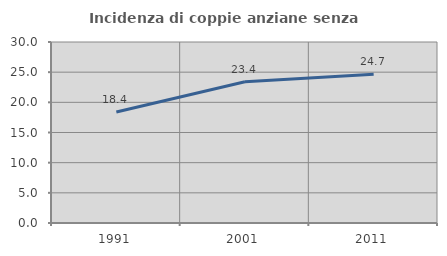
| Category | Incidenza di coppie anziane senza figli  |
|---|---|
| 1991.0 | 18.403 |
| 2001.0 | 23.413 |
| 2011.0 | 24.651 |